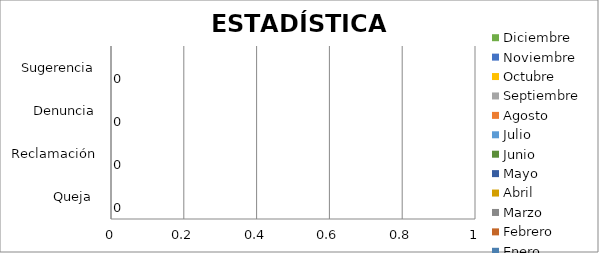
| Category | Enero | Febrero | Marzo | Abril | Mayo | Junio | Julio | Agosto | Septiembre | Octubre | Noviembre | Diciembre |
|---|---|---|---|---|---|---|---|---|---|---|---|---|
| Queja  | 0 | 0 | 0 | 0 | 0 | 0 |  |  |  |  |  |  |
| Reclamación | 0 | 0 | 0 | 0 | 0 | 0 |  |  |  |  |  |  |
| Denuncia | 0 | 0 | 0 | 0 | 0 | 0 |  |  |  |  |  |  |
| Sugerencia | 0 | 0 | 0 | 0 | 0 | 0 |  |  |  |  |  |  |